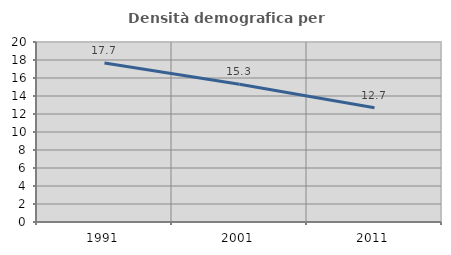
| Category | Densità demografica |
|---|---|
| 1991.0 | 17.664 |
| 2001.0 | 15.311 |
| 2011.0 | 12.689 |